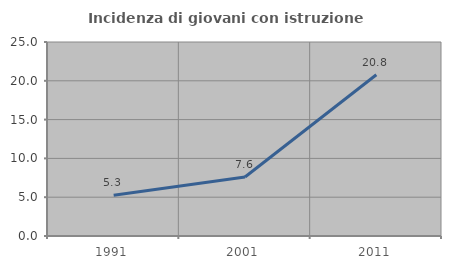
| Category | Incidenza di giovani con istruzione universitaria |
|---|---|
| 1991.0 | 5.251 |
| 2001.0 | 7.607 |
| 2011.0 | 20.774 |